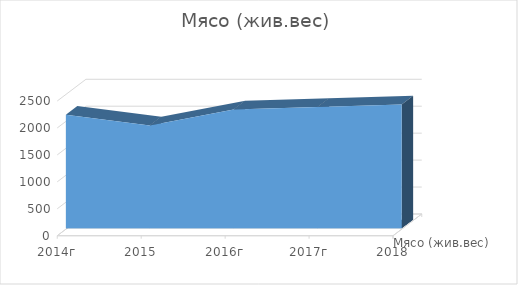
| Category | Мясо (жив.вес) |
|---|---|
| 2014г | 2109 |
| 2015 | 1910 |
| 2016г | 2206 |
| 2017г | 2254 |
| 2018 | 2300 |